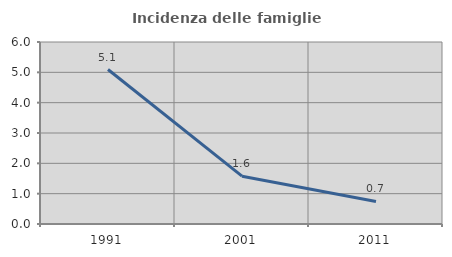
| Category | Incidenza delle famiglie numerose |
|---|---|
| 1991.0 | 5.093 |
| 2001.0 | 1.577 |
| 2011.0 | 0.743 |